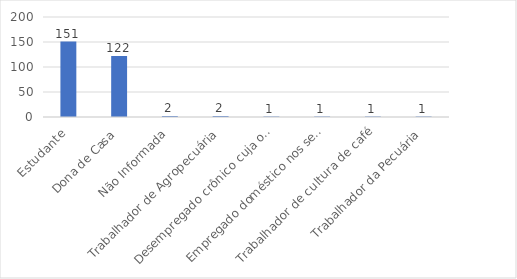
| Category | Series 0 |
|---|---|
| Estudante | 151 |
| Dona de Casa | 122 |
| Não Informada | 2 |
| Trabalhador de Agropecuária | 2 |
| Desempregado crônico cuja ocupação habitual não foi possível identificar | 1 |
| Empregado doméstico nos serviços gerais | 1 |
| Trabalhador de cultura de café | 1 |
| Trabalhador da Pecuária | 1 |